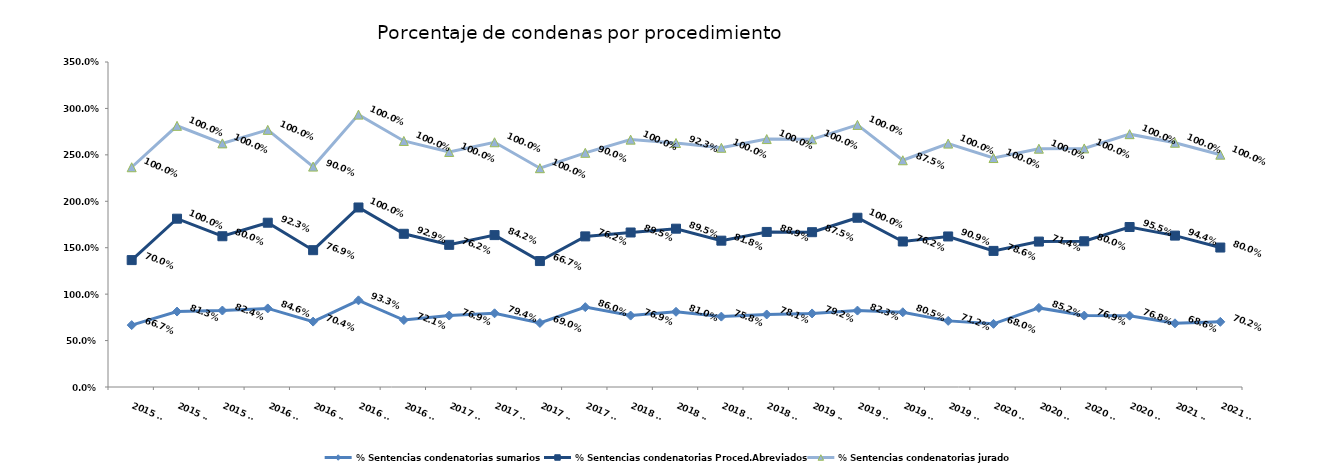
| Category | % Sentencias condenatorias sumarios | % Sentencias condenatorias Proced.Abreviados | % Sentencias condenatorias jurado |
|---|---|---|---|
| 2015 T2 | 0.667 | 0.7 | 1 |
| 2015 T3 | 0.812 | 1 | 1 |
| 2015 T4 | 0.824 | 0.8 | 1 |
| 2016 T1 | 0.846 | 0.923 | 1 |
| 2016 T2 | 0.704 | 0.769 | 0.9 |
| 2016 T3 | 0.933 | 1 | 1 |
| 2016 T4 | 0.721 | 0.929 | 1 |
| 2017 T1 | 0.769 | 0.762 | 1 |
| 2017 T2 | 0.794 | 0.842 | 1 |
| 2017 T3 | 0.69 | 0.667 | 1 |
| 2017 T4 | 0.86 | 0.762 | 0.9 |
| 2018 T1 | 0.769 | 0.895 | 1 |
| 2018 T2 | 0.81 | 0.895 | 0.923 |
| 2018 T3 | 0.758 | 0.818 | 1 |
| 2018 T4 | 0.781 | 0.889 | 1 |
| 2019 T1 | 0.792 | 0.875 | 1 |
| 2019 T2 | 0.823 | 1 | 1 |
| 2019 T3 | 0.805 | 0.762 | 0.875 |
| 2019 T4 | 0.712 | 0.909 | 1 |
| 2020 T1 | 0.68 | 0.786 | 1 |
| 2020 T2 | 0.852 | 0.714 | 1 |
| 2020 T3 | 0.769 | 0.8 | 1 |
| 2020 T4 | 0.768 | 0.955 | 1 |
| 2021 T1 | 0.686 | 0.944 | 1 |
| 2021 T2 | 0.702 | 0.8 | 1 |